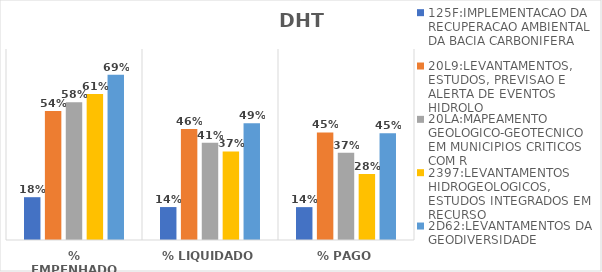
| Category | 125F:IMPLEMENTACAO DA RECUPERACAO AMBIENTAL DA BACIA CARBONIFERA | 20L9:LEVANTAMENTOS, ESTUDOS, PREVISAO E ALERTA DE EVENTOS HIDROLO | 20LA:MAPEAMENTO GEOLOGICO-GEOTECNICO EM MUNICIPIOS CRITICOS COM R | 2397:LEVANTAMENTOS HIDROGEOLOGICOS, ESTUDOS INTEGRADOS EM RECURSO | 2D62:LEVANTAMENTOS DA GEODIVERSIDADE |
|---|---|---|---|---|---|
| % EMPENHADO | 0.179 | 0.54 | 0.577 | 0.611 | 0.692 |
| % LIQUIDADO | 0.138 | 0.465 | 0.407 | 0.371 | 0.489 |
| % PAGO | 0.138 | 0.451 | 0.365 | 0.277 | 0.447 |